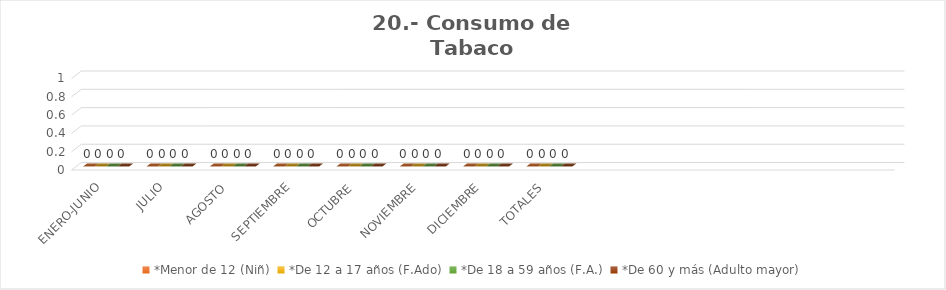
| Category | *Menor de 12 (Niñ) | *De 12 a 17 años (F.Ado) | *De 18 a 59 años (F.A.) | *De 60 y más (Adulto mayor) |
|---|---|---|---|---|
| ENERO-JUNIO | 0 | 0 | 0 | 0 |
| JULIO | 0 | 0 | 0 | 0 |
| AGOSTO | 0 | 0 | 0 | 0 |
| SEPTIEMBRE | 0 | 0 | 0 | 0 |
| OCTUBRE | 0 | 0 | 0 | 0 |
| NOVIEMBRE | 0 | 0 | 0 | 0 |
| DICIEMBRE | 0 | 0 | 0 | 0 |
| TOTALES | 0 | 0 | 0 | 0 |